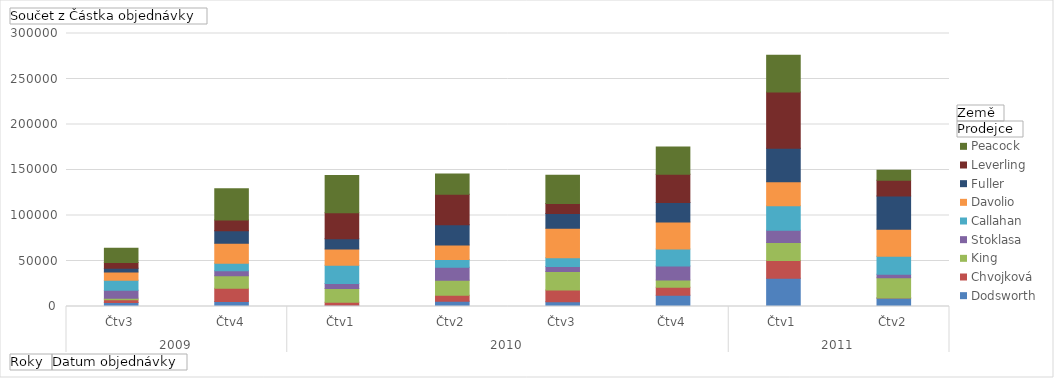
| Category | ČR - Dodsworth | ČR - Chvojková | ČR - King | ČR - Stoklasa | USA - Callahan | USA - Davolio | USA - Fuller | USA - Leverling | USA - Peacock |
|---|---|---|---|---|---|---|---|---|---|
| 0 | 4364.3 | 3058.82 | 1686 | 8794.74 | 11040 | 8892.48 | 4143.6 | 6415.3 | 15589.92 |
| 1 | 5530.21 | 14608.38 | 13546.16 | 5724.94 | 8120.7 | 21969.28 | 13667.86 | 11808.66 | 34355.19 |
| 2 | 1310.8 | 3237.12 | 15108.34 | 5583.16 | 19992.23 | 17885.82 | 11434.38 | 28406.85 | 41088.53 |
| 3 | 5692.28 | 6647.67 | 16437.92 | 14245.21 | 8686.72 | 15925.56 | 22136.67 | 33493.13 | 22389.61 |
| 4 | 5285.05 | 12975.8 | 20263.93 | 5481.65 | 9649.99 | 32394.91 | 16148.8 | 10888.96 | 31231.12 |
| 5 | 12468.76 | 8572.57 | 8017 | 15516.35 | 18625.08 | 29644.07 | 21448.29 | 30930.13 | 29946.3 |
| 6 | 31169.21 | 19481.89 | 19757.48 | 13320.13 | 27030.85 | 26351 | 36882.56 | 61797.58 | 40195.24 |
| 7 | 9227.43 | 210 | 22146.16 | 3861.45 | 19887.1 | 29436.97 | 36641.62 | 17455.66 | 10967.77 |